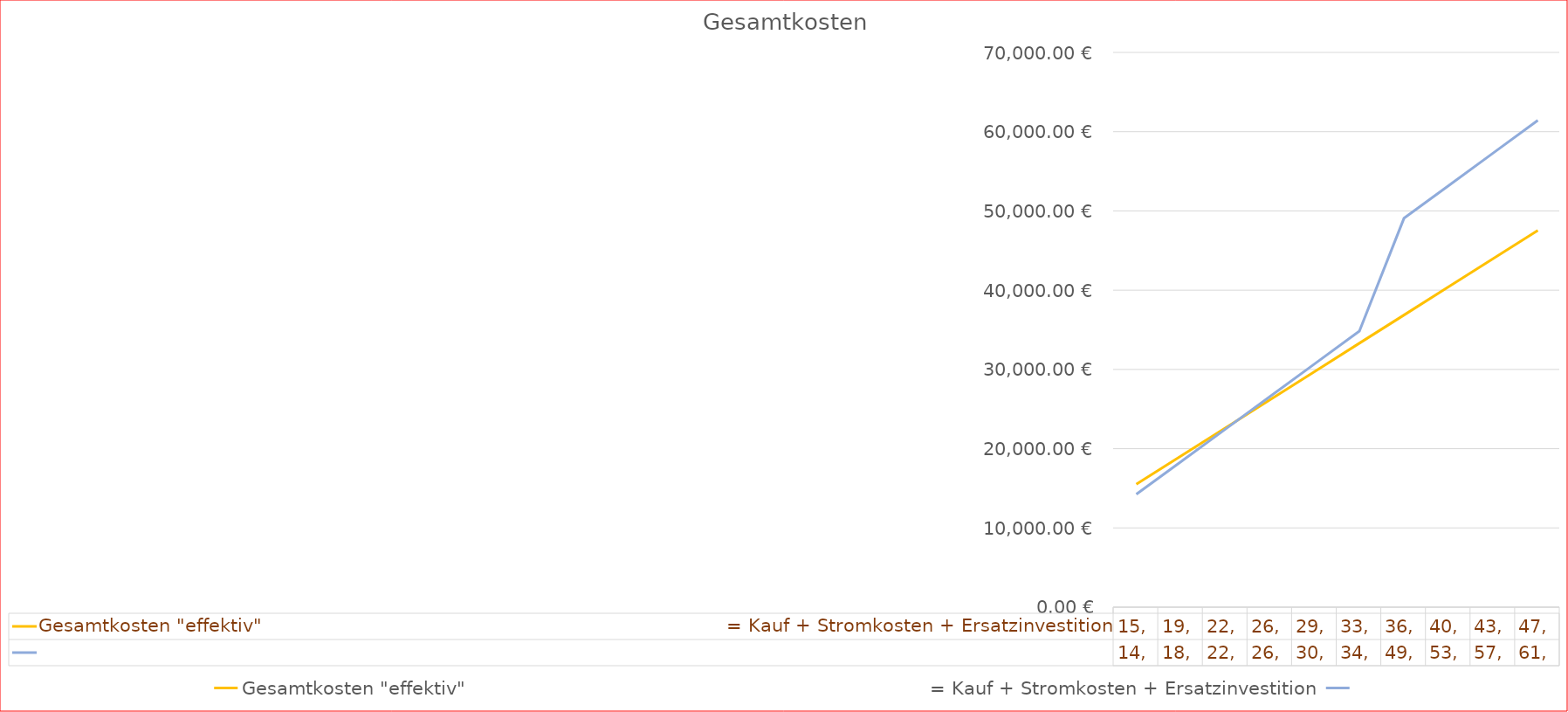
| Category | Gesamtkosten "effektiv"                                                                            = Kauf + Stromkosten + Ersatzinvestition | Series 1 |
|---|---|---|
|  | 15517.46 | 14239.164 |
|  | 19074.92 | 18358.329 |
|  | 22632.38 | 22477.493 |
|  | 26189.84 | 26596.657 |
|  | 29747.3 | 30715.821 |
|  | 33304.76 | 34834.986 |
|  | 36862.22 | 49074.15 |
|  | 40419.68 | 53193.314 |
|  | 43977.141 | 57312.479 |
|  | 47534.601 | 61431.643 |